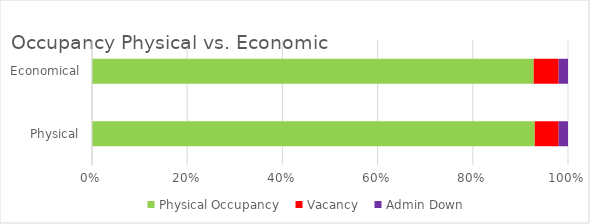
| Category | Physical Occupancy | Vacancy | Admin Down |
|---|---|---|---|
| Physical | 0.949 | 0.051 | 0.02 |
| Economical | 0.946 | 0.053 | 0.02 |